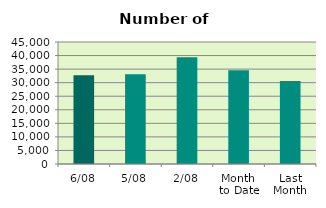
| Category | Series 0 |
|---|---|
| 6/08 | 32744 |
| 5/08 | 33100 |
| 2/08 | 39420 |
| Month 
to Date | 34575.5 |
| Last
Month | 30613.13 |